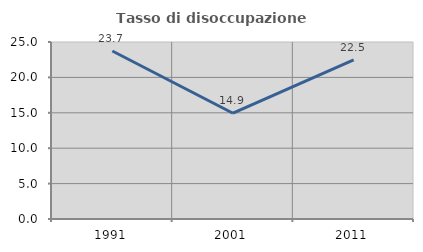
| Category | Tasso di disoccupazione giovanile  |
|---|---|
| 1991.0 | 23.729 |
| 2001.0 | 14.939 |
| 2011.0 | 22.47 |